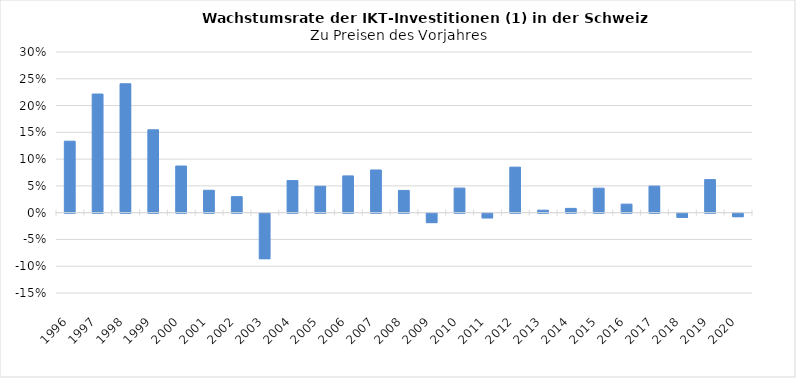
| Category | Total IKT (ohne Messinstrumente) |
|---|---|
| 1996 | 0.133 |
| 1997 | 0.222 |
| 1998 | 0.241 |
| 1999 | 0.155 |
| 2000 | 0.087 |
| 2001 | 0.042 |
| 2002 | 0.03 |
| 2003 | -0.085 |
| 2004 | 0.06 |
| 2005 | 0.049 |
| 2006 | 0.069 |
| 2007 | 0.08 |
| 2008 | 0.042 |
| 2009 | -0.018 |
| 2010 | 0.046 |
| 2011 | -0.009 |
| 2012 | 0.085 |
| 2013 | 0.005 |
| 2014 | 0.008 |
| 2015 | 0.046 |
| 2016 | 0.016 |
| 2017 | 0.05 |
| 2018 | -0.008 |
| 2019 | 0.062 |
| 2020 | -0.007 |